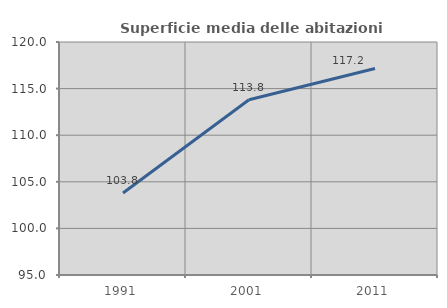
| Category | Superficie media delle abitazioni occupate |
|---|---|
| 1991.0 | 103.803 |
| 2001.0 | 113.812 |
| 2011.0 | 117.153 |